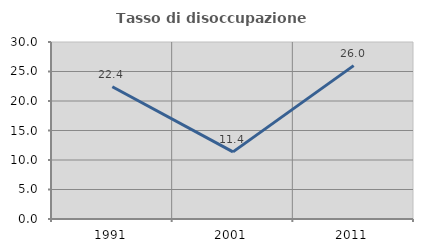
| Category | Tasso di disoccupazione giovanile  |
|---|---|
| 1991.0 | 22.414 |
| 2001.0 | 11.377 |
| 2011.0 | 26 |